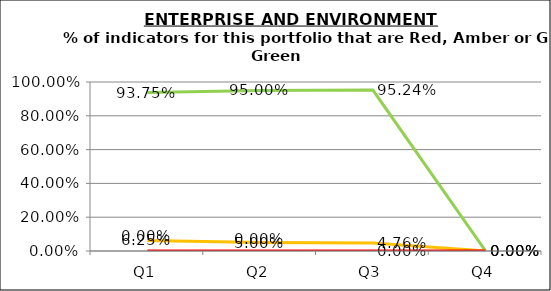
| Category | Green | Amber | Red |
|---|---|---|---|
| Q1 | 0.938 | 0.062 | 0 |
| Q2 | 0.95 | 0.05 | 0 |
| Q3 | 0.952 | 0.048 | 0 |
| Q4 | 0 | 0 | 0 |